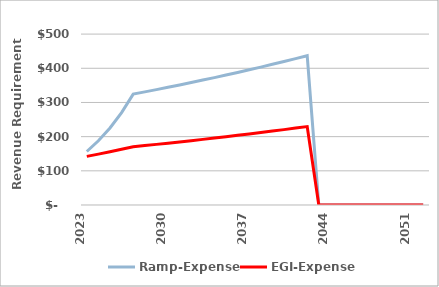
| Category | Ramp-Expense | EGI-Expense |
|---|---|---|
| 2023.0 | 156.486 | 142.26 |
| 2024.0 | 187.783 | 148.822 |
| 2025.0 | 225.34 | 155.701 |
| 2026.0 | 270.408 | 162.914 |
| 2027.0 | 324.489 | 170.475 |
| 2028.0 | 330.979 | 173.884 |
| 2029.0 | 337.599 | 177.362 |
| 2030.0 | 344.351 | 180.909 |
| 2031.0 | 351.238 | 184.527 |
| 2032.0 | 358.262 | 188.218 |
| 2033.0 | 365.428 | 191.982 |
| 2034.0 | 372.736 | 195.822 |
| 2035.0 | 380.191 | 199.738 |
| 2036.0 | 387.795 | 203.733 |
| 2037.0 | 395.551 | 207.808 |
| 2038.0 | 403.462 | 211.964 |
| 2039.0 | 411.531 | 216.203 |
| 2040.0 | 419.762 | 220.527 |
| 2041.0 | 428.157 | 224.938 |
| 2042.0 | 436.72 | 229.436 |
| 2043.0 | 0 | 0 |
| 2044.0 | 0 | 0 |
| 2045.0 | 0 | 0 |
| 2046.0 | 0 | 0 |
| 2047.0 | 0 | 0 |
| 2048.0 | 0 | 0 |
| 2049.0 | 0 | 0 |
| 2050.0 | 0 | 0 |
| 2051.0 | 0 | 0 |
| 2052.0 | 0 | 0 |